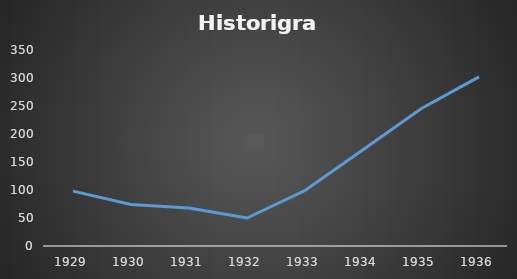
| Category | No.of cars |
|---|---|
| 1929.0 | 98 |
| 1930.0 | 74 |
| 1931.0 | 68 |
| 1932.0 | 50 |
| 1933.0 | 99 |
| 1934.0 | 172 |
| 1935.0 | 245 |
| 1936.0 | 302 |